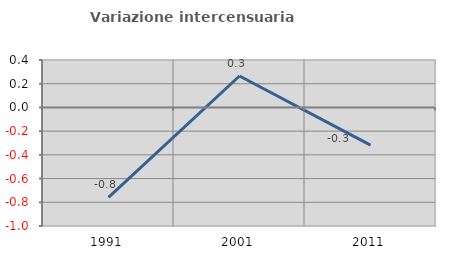
| Category | Variazione intercensuaria annua |
|---|---|
| 1991.0 | -0.758 |
| 2001.0 | 0.265 |
| 2011.0 | -0.318 |